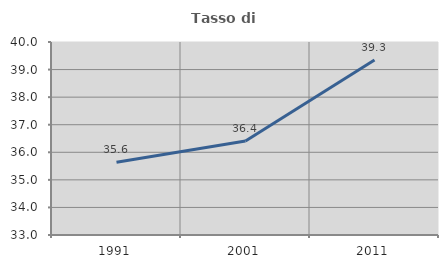
| Category | Tasso di occupazione   |
|---|---|
| 1991.0 | 35.637 |
| 2001.0 | 36.409 |
| 2011.0 | 39.345 |